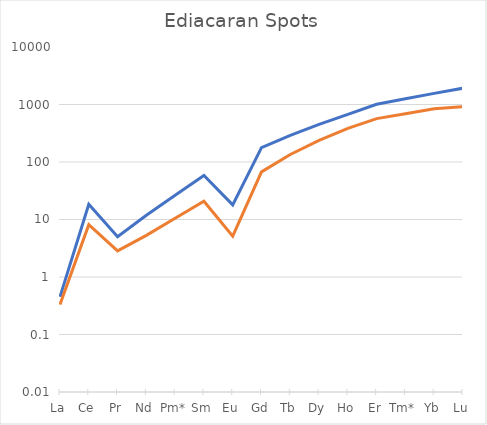
| Category | Series 0 | Series 1 |
|---|---|---|
| La | 0.452 | 0.332 |
| Ce | 18.442 | 8.108 |
| Pr | 5.021 | 2.846 |
| Nd | 11.869 | 5.303 |
| Pm* | 26.302 | 10.486 |
| Sm | 58.284 | 20.733 |
| Eu | 17.996 | 5.137 |
| Gd | 178.36 | 67.259 |
| Tb | 291.467 | 135.183 |
| Dy | 451.448 | 238.478 |
| Ho | 675.476 | 384.826 |
| Er | 1007.117 | 568.152 |
| Tm* | 1254.339 | 691.991 |
| Yb | 1562.248 | 842.823 |
| Lu | 1921.137 | 916.105 |